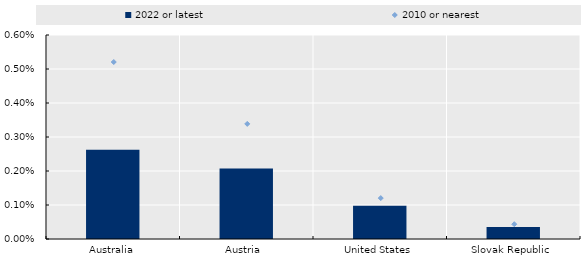
| Category | 2022 or latest |
|---|---|
| Australia | 0.003 |
| Austria  | 0.002 |
| United States | 0.001 |
| Slovak Republic | 0 |